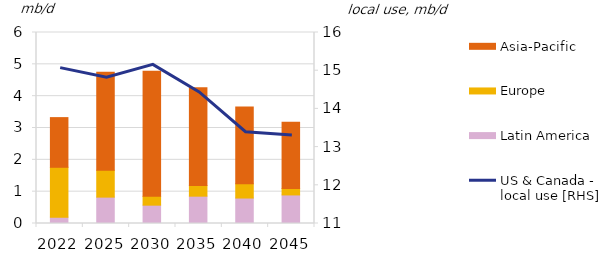
| Category | Latin America | Europe | Asia-Pacific |
|---|---|---|---|
| 2022.0 | 0.199 | 1.567 | 1.56 |
| 2025.0 | 0.828 | 0.843 | 3.076 |
| 2030.0 | 0.576 | 0.276 | 3.933 |
| 2035.0 | 0.858 | 0.333 | 3.075 |
| 2040.0 | 0.8 | 0.445 | 2.412 |
| 2045.0 | 0.897 | 0.2 | 2.087 |